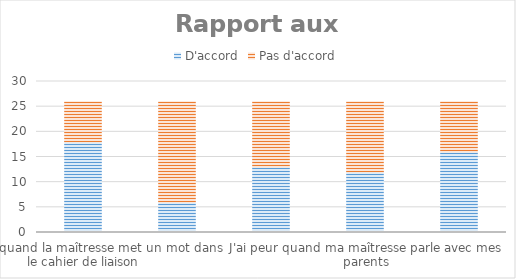
| Category | D'accord | Pas d'accord |
|---|---|---|
| J'ai peur quand la maîtresse met un mot dans le cahier de liaison | 18 | 8 |
| J'ai peur de montrer mon travail à mes parents | 6 | 20 |
| J'ai peur de me tromper quand je fais des exercices | 13 | 13 |
| J'ai peur quand ma maîtresse parle avec mes parents | 12 | 14 |
| J'ai peur d'avoir de mauvaises notes | 16 | 10 |